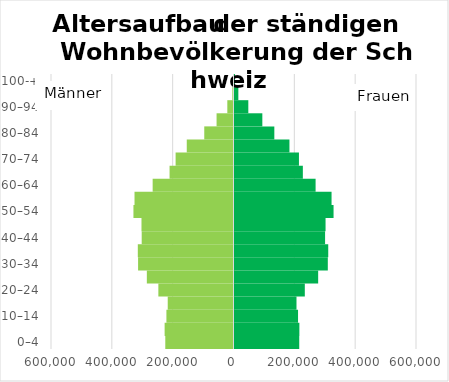
| Category | Männer | Frauen |
|---|---|---|
| 0–4 | -224268 | 212850 |
| 5–9 | -226409 | 213276 |
| 10–14 | -220562 | 208906 |
| 15–19 | -216228 | 203802 |
| 20–24 | -247027 | 231154 |
| 25–29 | -284900 | 275053 |
| 30–34 | -313683 | 306776 |
| 35–39 | -314591 | 308180 |
| 40–44 | -301811 | 297807 |
| 45–49 | -302514 | 299345 |
| 50–54 | -328949 | 325660 |
| 55–59 | -325419 | 319081 |
| 60–64 | -265775 | 266604 |
| 65–69 | -210196 | 224718 |
| 70–74 | -190316 | 211899 |
| 75–79 | -153639 | 180613 |
| 80–84 | -96134 | 130952 |
| 85–89 | -55660 | 91514 |
| 90–94 | -20336 | 45440 |
| 95–99 | -3874 | 12653 |
| 100-+ | -308 | 1418 |